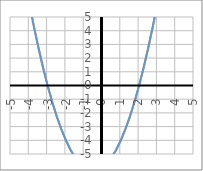
| Category | y |
|---|---|
| -5.0 | 14 |
| -4.75 | 11.812 |
| -4.5 | 9.75 |
| -4.25 | 7.812 |
| -4.0 | 6 |
| -3.75 | 4.312 |
| -3.5 | 2.75 |
| -3.25 | 1.312 |
| -3.0 | 0 |
| -2.75 | -1.188 |
| -2.5 | -2.25 |
| -2.25 | -3.188 |
| -2.0 | -4 |
| -1.75 | -4.688 |
| -1.5 | -5.25 |
| -1.25 | -5.688 |
| -1.0 | -6 |
| -0.75 | -6.188 |
| -0.5 | -6.25 |
| -0.25 | -6.188 |
| 0.0 | -6 |
| 0.25 | -5.688 |
| 0.5 | -5.25 |
| 0.75 | -4.688 |
| 1.0 | -4 |
| 1.25 | -3.188 |
| 1.5 | -2.25 |
| 1.75 | -1.188 |
| 2.0 | 0 |
| 2.25 | 1.312 |
| 2.5 | 2.75 |
| 2.75 | 4.312 |
| 3.0 | 6 |
| 3.25 | 7.812 |
| 3.5 | 9.75 |
| 3.75 | 11.812 |
| 4.0 | 14 |
| 4.25 | 16.312 |
| 4.5 | 18.75 |
| 4.75 | 21.312 |
| 5.0 | 24 |